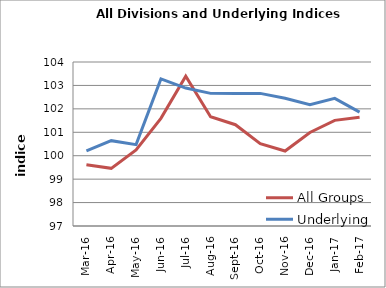
| Category | All Groups | Underlying |
|---|---|---|
| 2016-03-01 | 99.613 | 100.206 |
| 2016-04-01 | 99.461 | 100.642 |
| 2016-05-01 | 100.244 | 100.472 |
| 2016-06-01 | 101.595 | 103.278 |
| 2016-07-01 | 103.397 | 102.887 |
| 2016-08-01 | 101.664 | 102.661 |
| 2016-09-01 | 101.323 | 102.652 |
| 2016-10-01 | 100.517 | 102.66 |
| 2016-11-01 | 100.201 | 102.451 |
| 2016-12-01 | 100.991 | 102.18 |
| 2017-01-01 | 101.51 | 102.449 |
| 2017-02-01 | 101.644 | 101.858 |